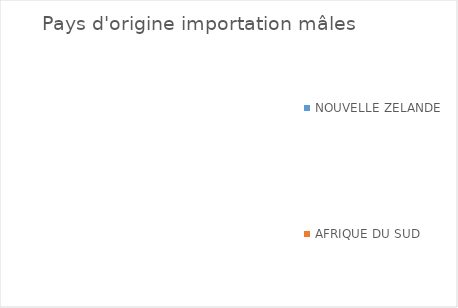
| Category | Series 0 |
|---|---|
| NOUVELLE ZELANDE | 0 |
| AFRIQUE DU SUD | 0 |